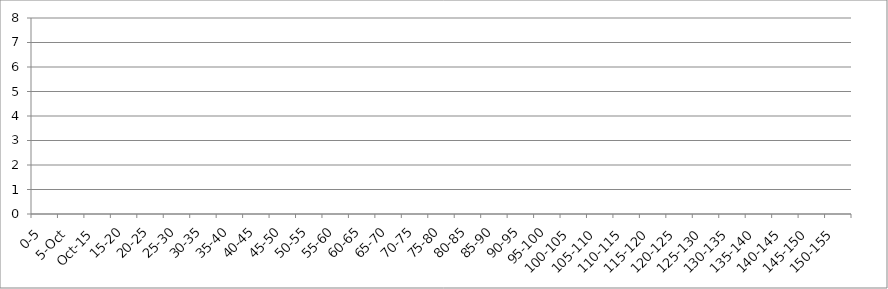
| Category | UNION_ALL | INTERSECTION_ALL | UNION(INTERSECTION_119875_146067,INTERSECTION_119875_241240,INTERSECTION_146067_241240) |
|---|---|---|---|
| 0-5 | 0 | 0 | 0 |
| 5.Oct | 0 | 0 | 0 |
| Oct.15 | 0 | 0 | 0 |
| 15-20 | 0 | 0 | 0 |
| 20-25 | 0 | 0 | 0 |
| 25-30 | 0 | 0 | 0 |
| 30-35 | 0 | 0 | 0 |
| 35-40 | 0 | 0 | 0 |
| 40-45 | 0 | 0 | 0 |
| 45-50 | 0 | 0 | 0 |
| 50-55 | 0 | 0 | 0 |
| 55-60 | 0 | 0 | 0 |
| 60-65 | 0 | 0 | 0 |
| 65-70 | 0 | 0 | 0 |
| 70-75 | 0 | 0 | 0 |
| 75-80 | 0 | 0 | 0 |
| 80-85 | 0 | 0 | 0 |
| 85-90 | 0 | 0 | 0 |
| 90-95 | 0 | 0 | 0 |
| 95-100 | 0 | 0 | 0 |
| 100-105 | 0 | 0 | 0 |
| 105-110 | 0 | 0 | 0 |
| 110-115 | 0 | 0 | 0 |
| 115-120 | 0 | 0 | 0 |
| 120-125 | 0 | 0 | 0 |
| 125-130 | 0 | 0 | 0 |
| 130-135 | 0 | 0 | 0 |
| 135-140 | 0 | 0 | 0 |
| 140-145 | 0 | 0 | 0 |
| 145-150 | 0 | 0 | 0 |
| 150-155 | 0 | 0 | 0 |